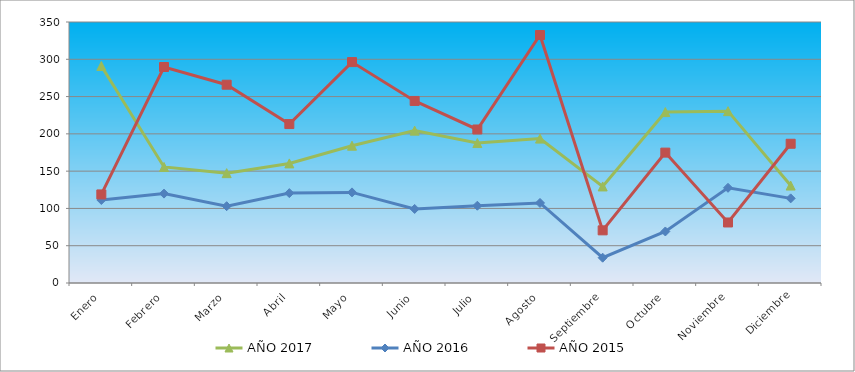
| Category | AÑO 2017 | AÑO 2016 | AÑO 2015 |
|---|---|---|---|
| Enero | 291.039 | 111.317 | 118.764 |
| Febrero | 155.617 | 119.88 | 289.652 |
| Marzo | 147.302 | 103.014 | 265.899 |
| Abril | 160.369 | 120.539 | 213.115 |
| Mayo | 184.127 | 121.519 | 296.25 |
| Junio | 204.322 | 99.312 | 244.126 |
| Julio | 187.691 | 103.63 | 205.857 |
| Agosto | 193.63 | 107.331 | 332.539 |
| Septiembre | 129.483 | 33.927 | 70.599 |
| Octubre | 229.268 | 69.087 | 174.847 |
| Noviembre | 230.456 | 127.687 | 81.155 |
| Diciembre | 130.671 | 113.5 | 186.723 |